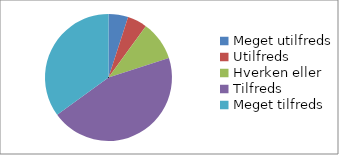
| Category | Hvor tilfreds er du med workshoppen 'Erhvervsrettede studieforløb på civilingeniøruddannelserne'? (n=20) |
|---|---|
| Meget utilfreds | 0.05 |
| Utilfreds | 0.05 |
| Hverken eller | 0.1 |
| Tilfreds | 0.45 |
| Meget tilfreds | 0.35 |